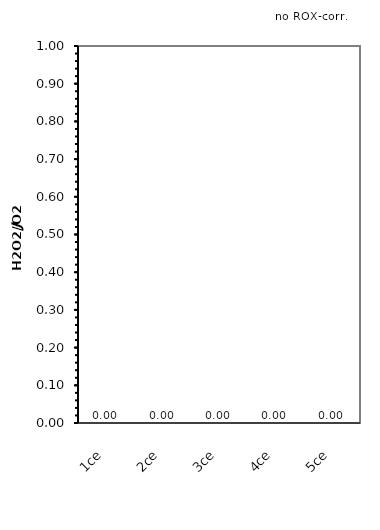
| Category | no ROX-corr. |
|---|---|
| 1ce | 0 |
| 2ce | 0 |
| 3ce | 0 |
| 4ce | 0 |
| 5ce | 0 |